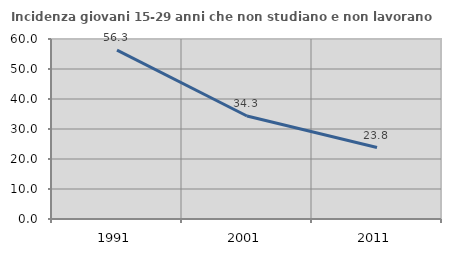
| Category | Incidenza giovani 15-29 anni che non studiano e non lavorano  |
|---|---|
| 1991.0 | 56.281 |
| 2001.0 | 34.328 |
| 2011.0 | 23.81 |